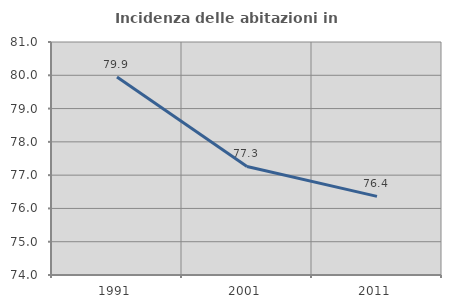
| Category | Incidenza delle abitazioni in proprietà  |
|---|---|
| 1991.0 | 79.949 |
| 2001.0 | 77.26 |
| 2011.0 | 76.361 |